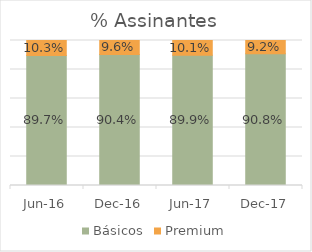
| Category | Básicos | Premium |
|---|---|---|
| 2016-06-01 | 0.897 | 0.103 |
| 2016-12-01 | 0.904 | 0.096 |
| 2017-06-01 | 0.899 | 0.101 |
| 2017-12-01 | 0.908 | 0.092 |